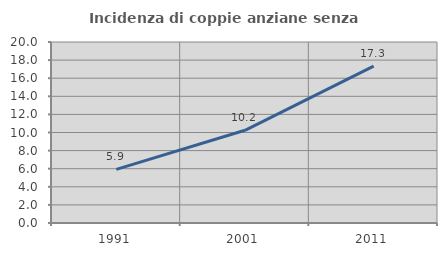
| Category | Incidenza di coppie anziane senza figli  |
|---|---|
| 1991.0 | 5.931 |
| 2001.0 | 10.244 |
| 2011.0 | 17.343 |